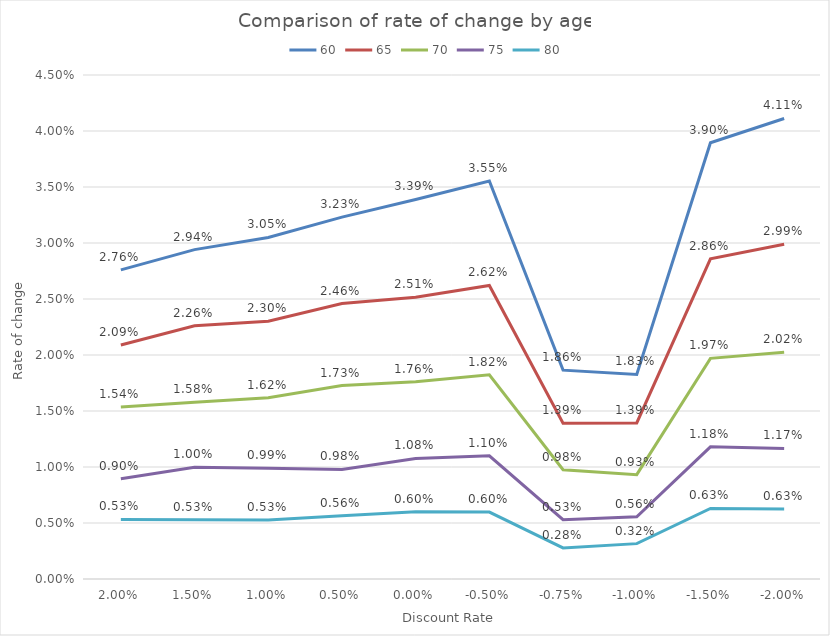
| Category | 60 | 65 | 70 | 75 | 80 |
|---|---|---|---|---|---|
| 0.02 | 0.028 | 0.021 | 0.015 | 0.009 | 0.005 |
| 0.015 | 0.029 | 0.023 | 0.016 | 0.01 | 0.005 |
| 0.01 | 0.03 | 0.023 | 0.016 | 0.01 | 0.005 |
| 0.005 | 0.032 | 0.025 | 0.017 | 0.01 | 0.006 |
| 0.0 | 0.034 | 0.025 | 0.018 | 0.011 | 0.006 |
| -0.005 | 0.036 | 0.026 | 0.018 | 0.011 | 0.006 |
| -0.0075 | 0.019 | 0.014 | 0.01 | 0.005 | 0.003 |
| -0.01 | 0.018 | 0.014 | 0.009 | 0.006 | 0.003 |
| -0.015 | 0.039 | 0.029 | 0.02 | 0.012 | 0.006 |
| -0.02 | 0.041 | 0.03 | 0.02 | 0.012 | 0.006 |